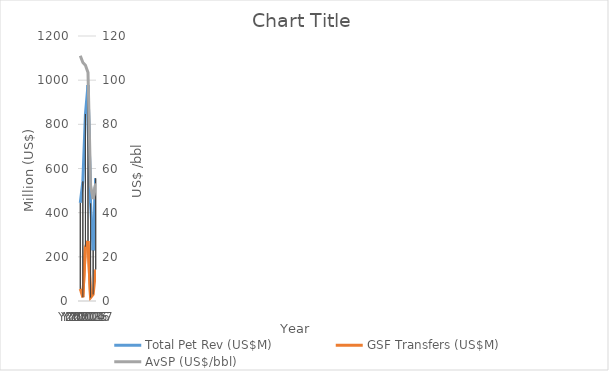
| Category | Total Pet Rev (US$M) | GSF Transfers (US$M) |
|---|---|---|
| Y2011 | 444.13 | 54.81 |
| Y2012 | 541.62 | 16.88 |
| Y2013 | 846.56 | 245.73 |
| Y2014 | 978.01 | 271.76 |
| Y2015 | 441.51 | 15.17 |
| Y2016 | 229.14 | 29.51 |
| Y2017 | 555.33 | 142.68 |